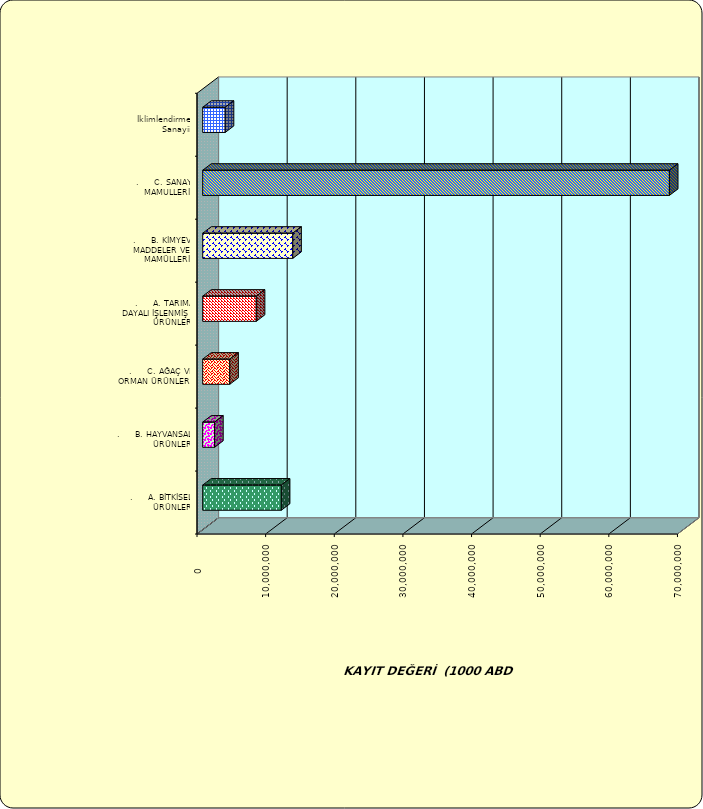
| Category | Series 0 |
|---|---|
| .     A. BİTKİSEL ÜRÜNLER | 11452599.565 |
| .     B. HAYVANSAL ÜRÜNLER | 1734058.544 |
| .     C. AĞAÇ VE ORMAN ÜRÜNLERİ | 3943696.581 |
| .     A. TARIMA DAYALI İŞLENMİŞ ÜRÜNLER | 7803354.342 |
| .     B. KİMYEVİ MADDELER VE MAMÜLLERİ | 13122588.965 |
| .     C. SANAYİ MAMULLERİ | 67995551.597 |
|  İklimlendirme Sanayii | 3278405.124 |